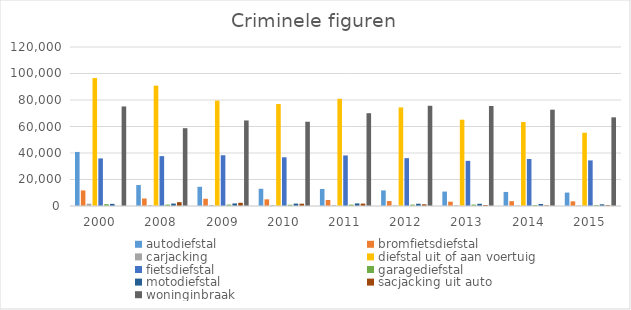
| Category | autodiefstal | bromfietsdiefstal | carjacking | diefstal uit of aan voertuig  | fietsdiefstal | garagediefstal | motodiefstal | sacjacking uit auto | woninginbraak |
|---|---|---|---|---|---|---|---|---|---|
| 2000.0 | 40801 | 11748 | 1749 | 96581 | 35921 | 1387 | 1596 | 0 | 75124 |
| 2008.0 | 15802 | 5655 | 589 | 90822 | 37631 | 1069 | 1849 | 2902 | 58720 |
| 2009.0 | 14505 | 5471 | 701 | 79536 | 38304 | 1060 | 1930 | 2430 | 64546 |
| 2010.0 | 12996 | 5038 | 623 | 76976 | 36777 | 939 | 1817 | 1738 | 63600 |
| 2011.0 | 12858 | 4553 | 627 | 80937 | 38150 | 1033 | 1966 | 1805 | 70039 |
| 2012.0 | 11782 | 3727 | 459 | 74432 | 36112 | 1050 | 1702 | 1294 | 75640 |
| 2013.0 | 10884 | 3241 | 450 | 65129 | 34089 | 1073 | 1670 | 756 | 75476 |
| 2014.0 | 10601 | 3655 | 367 | 63388 | 35457 | 746 | 1524 | 458 | 72684 |
| 2015.0 | 10123 | 3508 | 381 | 55297 | 34415 | 762 | 1267 | 608 | 66919 |